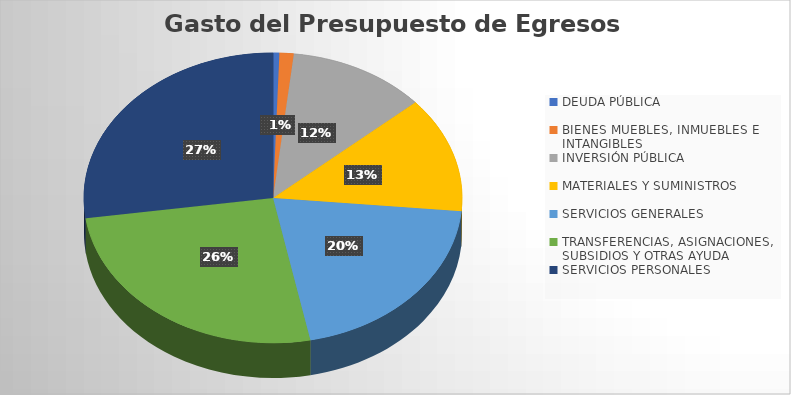
| Category | %  del Presup.  |
|---|---|
| DEUDA PÚBLICA | 0.005 |
| BIENES MUEBLES, INMUEBLES E INTANGIBLES | 0.012 |
| INVERSIÓN PÚBLICA | 0.118 |
| MATERIALES Y SUMINISTROS | 0.129 |
| SERVICIOS GENERALES | 0.204 |
| TRANSFERENCIAS, ASIGNACIONES, SUBSIDIOS Y OTRAS AYUDA | 0.259 |
| SERVICIOS PERSONALES | 0.273 |